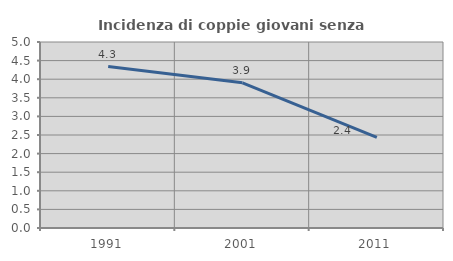
| Category | Incidenza di coppie giovani senza figli |
|---|---|
| 1991.0 | 4.34 |
| 2001.0 | 3.903 |
| 2011.0 | 2.439 |